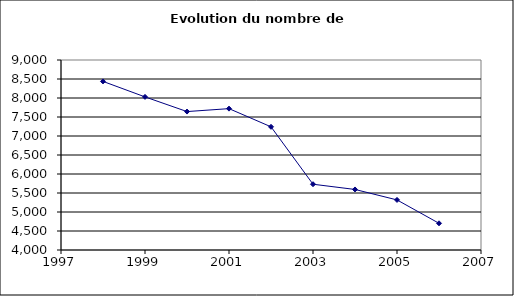
| Category | Series 0 |
|---|---|
| 1998.0 | 8437 |
| 1999.0 | 8029 |
| 2000.0 | 7643 |
| 2001.0 | 7720 |
| 2002.0 | 7242 |
| 2003.0 | 5731 |
| 2004.0 | 5593 |
| 2005.0 | 5318 |
| 2006.0 | 4703 |